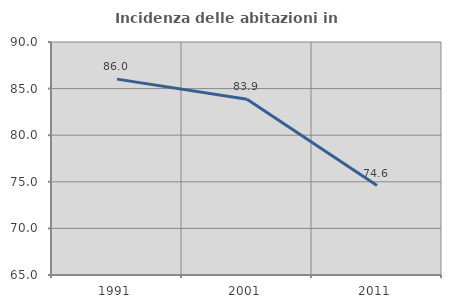
| Category | Incidenza delle abitazioni in proprietà  |
|---|---|
| 1991.0 | 86.016 |
| 2001.0 | 83.853 |
| 2011.0 | 74.593 |